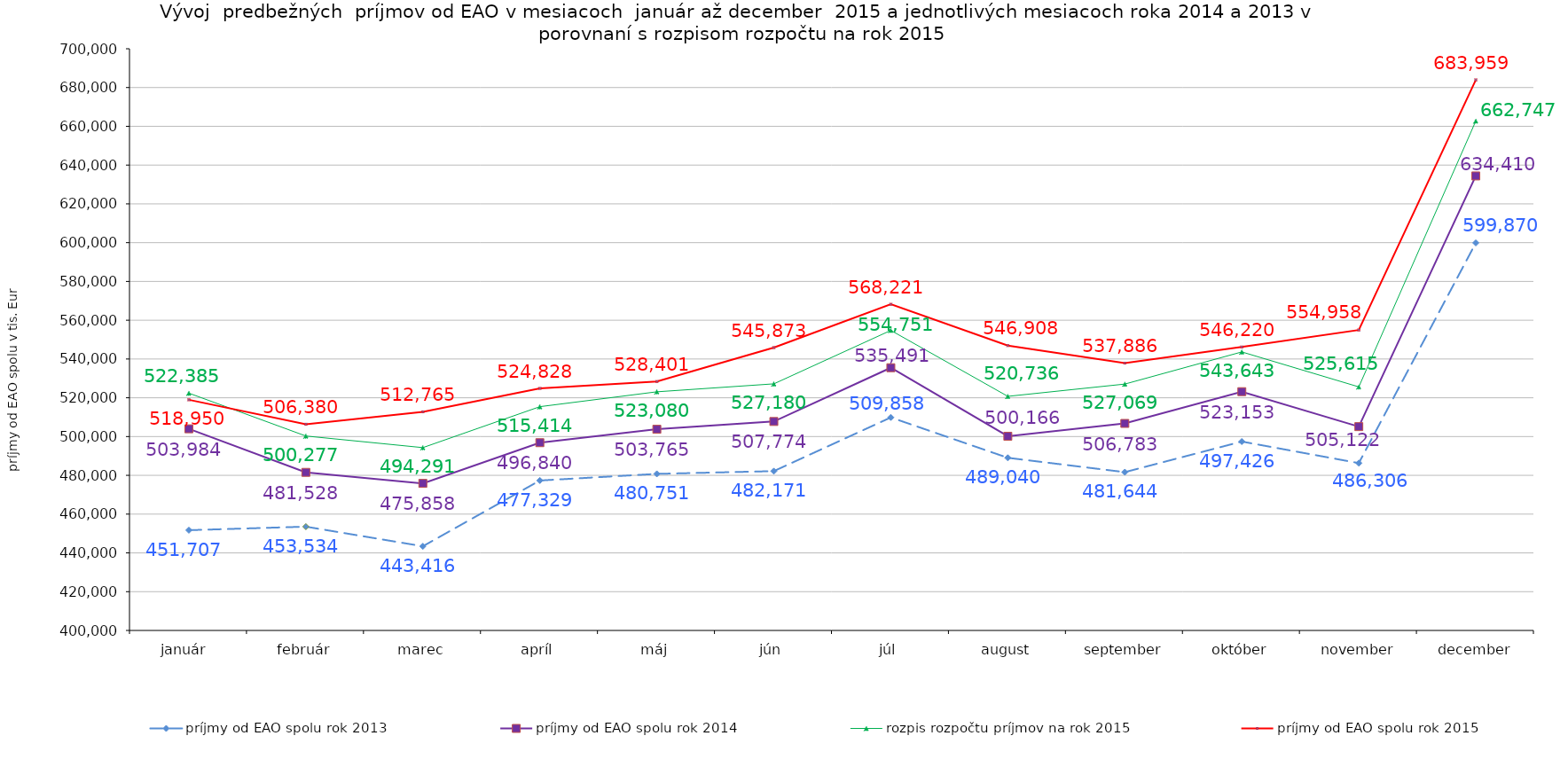
| Category | príjmy od EAO spolu rok 2013 | príjmy od EAO spolu rok 2014 | rozpis rozpočtu príjmov na rok 2015 | príjmy od EAO spolu rok 2015 |
|---|---|---|---|---|
| január  | 451707 | 503984 | 522385.231 | 518950 |
| február | 453534 | 481528 | 500276.65 | 506380 |
| marec | 443416 | 475858 | 494290.575 | 512765 |
| apríl | 477329 | 496840 | 515414.072 | 524828 |
| máj | 480751 | 503765 | 523080.297 | 528401 |
| jún | 482171 | 507774 | 527180.096 | 545873 |
| júl | 509858 | 535491 | 554751.493 | 568221 |
| august | 489040 | 500166 | 520736.258 | 546908 |
| september | 481644 | 506783 | 527069.43 | 537886 |
| október | 497426 | 523153 | 543642.669 | 546220 |
| november | 486306 | 505122 | 525614.969 | 554958 |
| december | 599870 | 634410 | 662746.586 | 683959 |